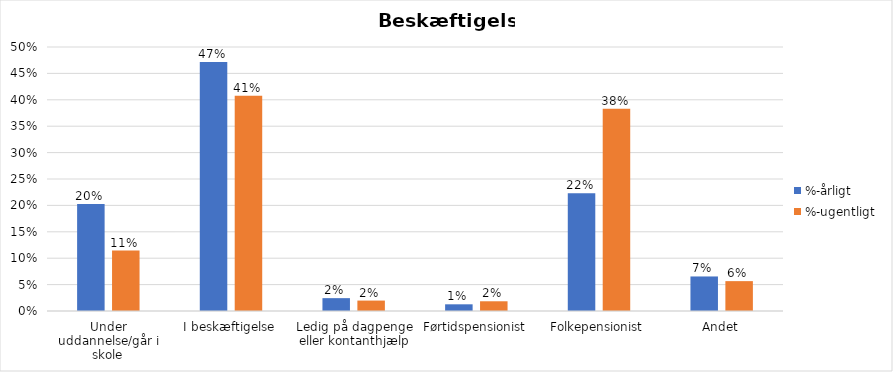
| Category | %-årligt | %-ugentligt |
|---|---|---|
| Under uddannelse/går i skole | 0.203 | 0.114 |
| I beskæftigelse | 0.472 | 0.408 |
| Ledig på dagpenge eller kontanthjælp | 0.024 | 0.02 |
| Førtidspensionist | 0.013 | 0.018 |
| Folkepensionist | 0.223 | 0.383 |
| Andet | 0.065 | 0.057 |